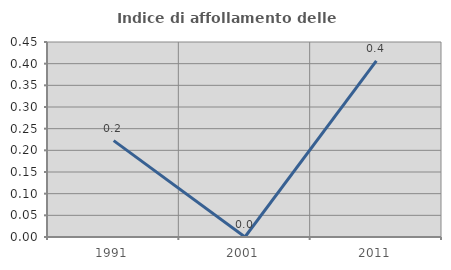
| Category | Indice di affollamento delle abitazioni  |
|---|---|
| 1991.0 | 0.222 |
| 2001.0 | 0 |
| 2011.0 | 0.407 |